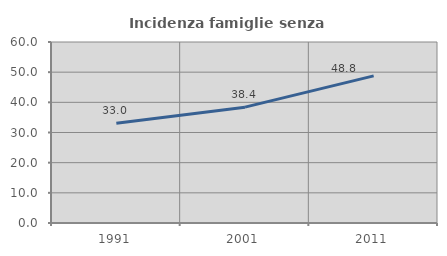
| Category | Incidenza famiglie senza nuclei |
|---|---|
| 1991.0 | 33.036 |
| 2001.0 | 38.4 |
| 2011.0 | 48.76 |